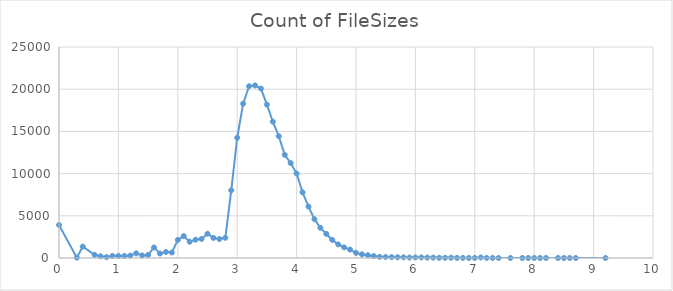
| Category | Count of FileSizes |
|---|---|
| 0.0 | 3913 |
| 0.3 | 37 |
| 0.4 | 1354 |
| 0.6 | 373 |
| 0.7 | 203 |
| 0.8 | 102 |
| 0.9 | 253 |
| 1.0 | 245 |
| 1.1 | 245 |
| 1.2 | 289 |
| 1.3 | 552 |
| 1.4 | 303 |
| 1.5 | 359 |
| 1.6 | 1247 |
| 1.7 | 524 |
| 1.8 | 711 |
| 1.9 | 649 |
| 2.0 | 2140 |
| 2.1 | 2600 |
| 2.2 | 1929 |
| 2.3 | 2166 |
| 2.4 | 2257 |
| 2.5 | 2876 |
| 2.6 | 2382 |
| 2.7 | 2245 |
| 2.8 | 2394 |
| 2.9 | 8020 |
| 3.0 | 14247 |
| 3.1 | 18286 |
| 3.2 | 20354 |
| 3.3 | 20446 |
| 3.4 | 20074 |
| 3.5 | 18176 |
| 3.6 | 16148 |
| 3.7 | 14440 |
| 3.8 | 12233 |
| 3.9 | 11251 |
| 4.0 | 10008 |
| 4.1 | 7781 |
| 4.2 | 6092 |
| 4.3 | 4596 |
| 4.4 | 3577 |
| 4.5 | 2854 |
| 4.6 | 2146 |
| 4.7 | 1614 |
| 4.8 | 1264 |
| 4.9 | 995 |
| 5.0 | 610 |
| 5.1 | 434 |
| 5.2 | 330 |
| 5.3 | 229 |
| 5.4 | 129 |
| 5.5 | 117 |
| 5.6 | 100 |
| 5.7 | 89 |
| 5.8 | 78 |
| 5.9 | 59 |
| 6.0 | 66 |
| 6.1 | 72 |
| 6.2 | 48 |
| 6.3 | 47 |
| 6.4 | 20 |
| 6.5 | 20 |
| 6.6 | 32 |
| 6.7 | 12 |
| 6.8 | 8 |
| 6.9 | 6 |
| 7.0 | 13 |
| 7.1 | 64 |
| 7.2 | 9 |
| 7.3 | 5 |
| 7.4 | 3 |
| 7.6 | 4 |
| 7.8 | 1 |
| 7.9 | 3 |
| 8.0 | 3 |
| 8.1 | 3 |
| 8.2 | 3 |
| 8.4 | 2 |
| 8.5 | 2 |
| 8.6 | 2 |
| 8.7 | 2 |
| 9.2 | 1 |